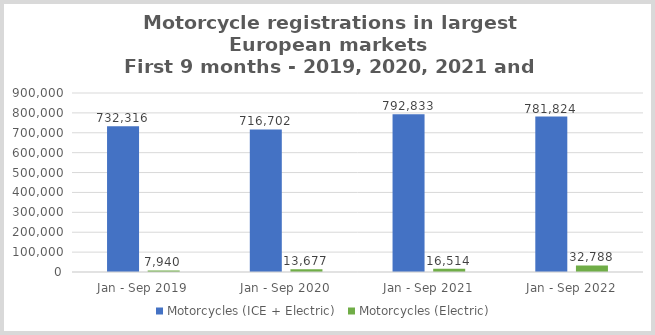
| Category | Motorcycles (ICE + Electric)  | Motorcycles (Electric)  |
|---|---|---|
| Jan - Sep 2019 | 732316 | 7940 |
| Jan - Sep 2020 | 716702 | 13677 |
| Jan - Sep 2021 | 792833 | 16514 |
| Jan - Sep 2022 | 781824 | 32788 |